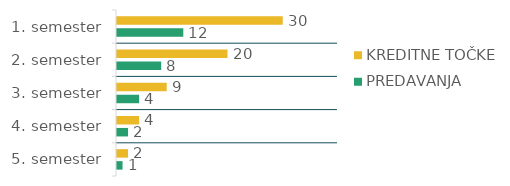
| Category | KREDITNE TOČKE  | PREDAVANJA  |
|---|---|---|
| 1. semester | 30 | 12 |
| 2. semester | 20 | 8 |
| 3. semester | 9 | 4 |
| 4. semester | 4 | 2 |
| 5. semester | 2 | 1 |